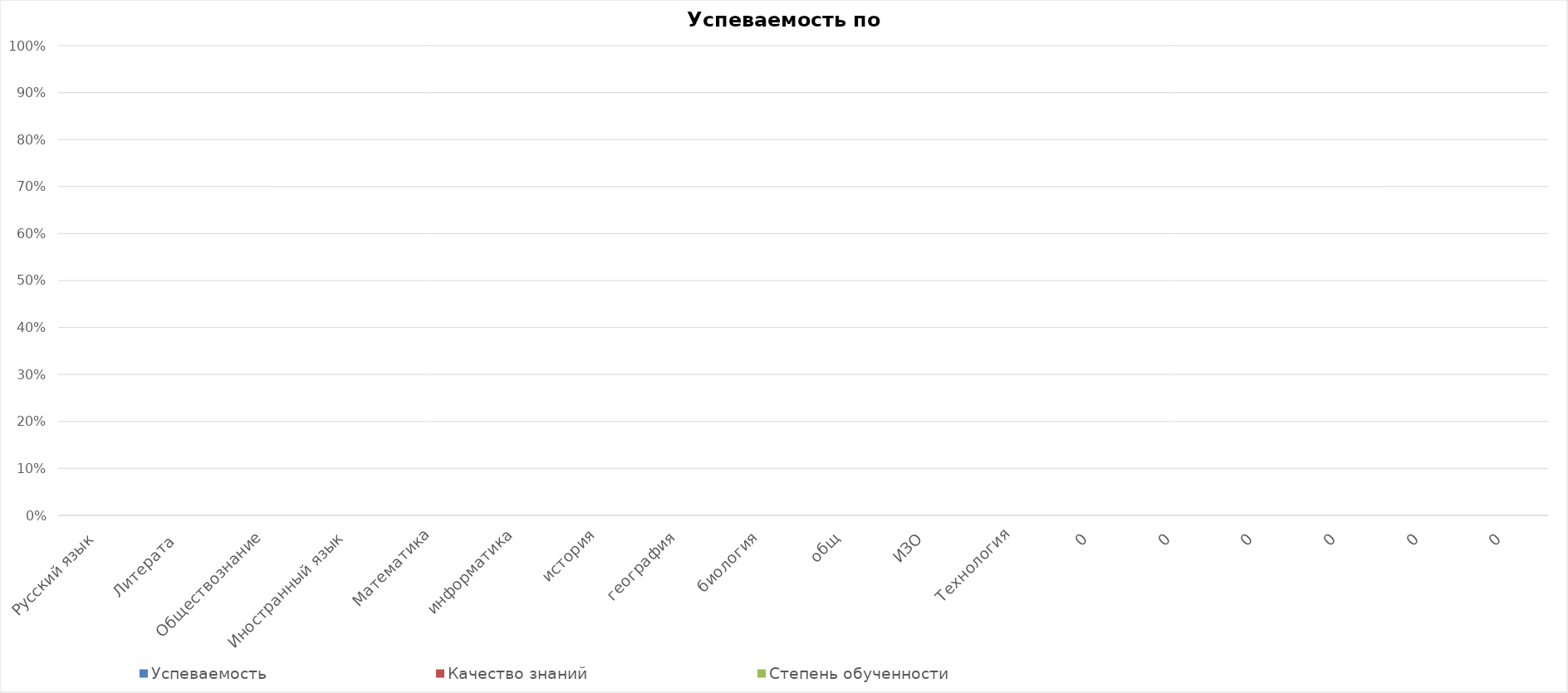
| Category | Успеваемость | Качество знаний | Степень обученности |
|---|---|---|---|
| Русский язык | 0 | 0 | 0 |
| Литерата  | 0 | 0 | 0 |
| Обществознание | 0 | 0 | 0 |
| Иностранный язык | 0 | 0 | 0 |
| Математика | 0 | 0 | 0 |
| информатика | 0 | 0 | 0 |
| история | 0 | 0 | 0 |
| география | 0 | 0 | 0 |
| биология | 0 | 0 | 0 |
| общ | 0 | 0 | 0 |
| ИЗО | 0 | 0 | 0 |
| Технология | 0 | 0 | 0 |
| 0 | 0 | 0 | 0 |
| 0 | 0 | 0 | 0 |
| 0 | 0 | 0 | 0 |
| 0 | 0 | 0 | 0 |
| 0 | 0 | 0 | 0 |
| 0 | 0 | 0 | 0 |